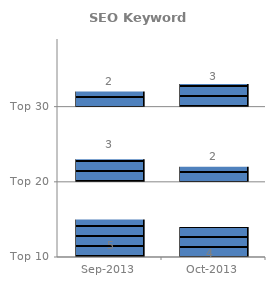
| Category | Top 10 | Fill | Top 20 | Top 30 |
|---|---|---|---|---|
| 2013-09-01 | 15 | 8 | 3 | 2 |
| 2013-10-01 | 14 | 7 | 2 | 3 |